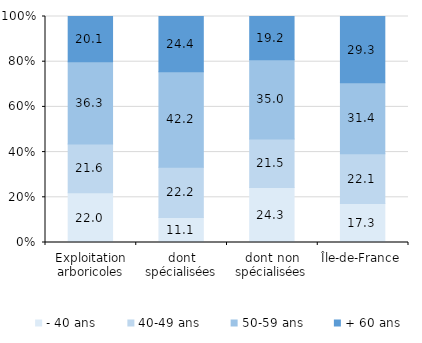
| Category | - 40 ans | 40-49 ans | 50-59 ans | + 60 ans |
|---|---|---|---|---|
| Exploitation arboricoles | 22.008 | 21.622 | 36.293 | 20.077 |
| dont spécialisées | 11.111 | 22.222 | 42.222 | 24.444 |
| dont non spécialisées | 24.299 | 21.495 | 35.047 | 19.159 |
| Île-de-France | 17.266 | 22.056 | 31.367 | 29.311 |